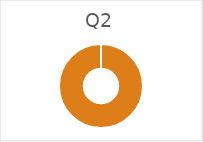
| Category | Q2 |
|---|---|
| 0 | 0 |
| 1 | 143440 |